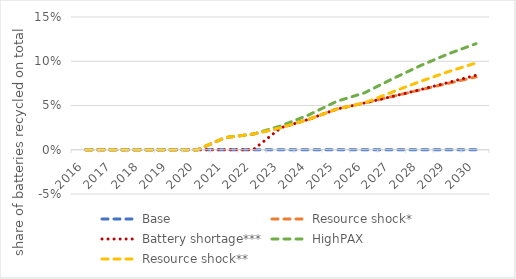
| Category | Base | Resource shock* | Battery shortage*** | HighPAX | Resource shock** |
|---|---|---|---|---|---|
| 2016.0 | 0 | 0 | 0 | 0 | 0 |
| 2017.0 | 0 | 0 | 0 | 0 | 0 |
| 2018.0 | 0 | 0 | 0 | 0 | 0 |
| 2019.0 | 0 | 0 | 0 | 0 | 0 |
| 2020.0 | 0 | 0 | 0 | 0 | 0 |
| 2021.0 | 0 | 0.014 | 0 | 0.014 | 0.014 |
| 2022.0 | 0 | 0.018 | 0 | 0.018 | 0.018 |
| 2023.0 | 0 | 0.025 | 0.025 | 0.027 | 0.025 |
| 2024.0 | 0 | 0.034 | 0.034 | 0.039 | 0.034 |
| 2025.0 | 0 | 0.046 | 0.046 | 0.055 | 0.046 |
| 2026.0 | 0 | 0.053 | 0.053 | 0.064 | 0.053 |
| 2027.0 | 0 | 0.06 | 0.06 | 0.08 | 0.065 |
| 2028.0 | 0 | 0.068 | 0.068 | 0.095 | 0.077 |
| 2029.0 | 0 | 0.075 | 0.076 | 0.108 | 0.088 |
| 2030.0 | 0 | 0.082 | 0.084 | 0.12 | 0.098 |